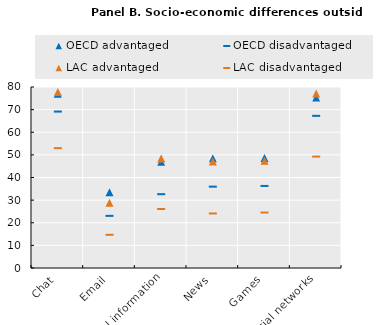
| Category | OECD | LAC |
|---|---|---|
| Chat | 69.141 | 52.974 |
| Email | 23.04 | 14.659 |
| Practical information | 32.624 | 26.079 |
| News | 35.961 | 24.101 |
| Games | 36.269 | 24.517 |
| Social networks | 67.251 | 49.245 |